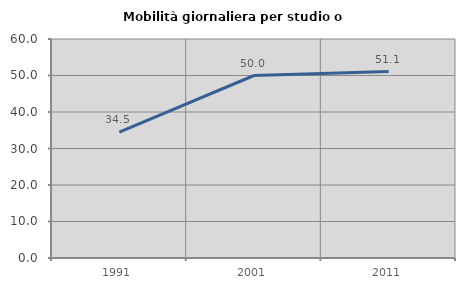
| Category | Mobilità giornaliera per studio o lavoro |
|---|---|
| 1991.0 | 34.483 |
| 2001.0 | 50 |
| 2011.0 | 51.064 |